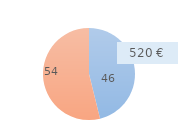
| Category | Series 0 |
|---|---|
| 0 | 46.13 |
| 1 | 53.87 |
| 2 | 0 |